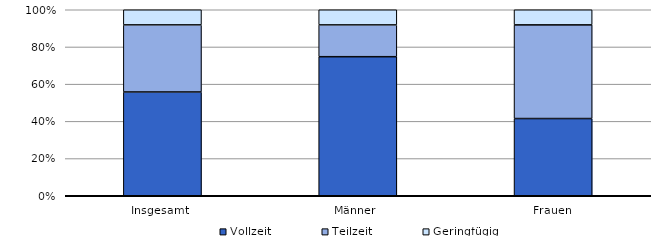
| Category | Vollzeit | Teilzeit | Geringfügig |
|---|---|---|---|
| Insgesamt  | 55.793 | 36.073 | 8.134 |
| Männer  | 74.764 | 17.09 | 8.146 |
| Frauen | 41.507 | 50.367 | 8.125 |